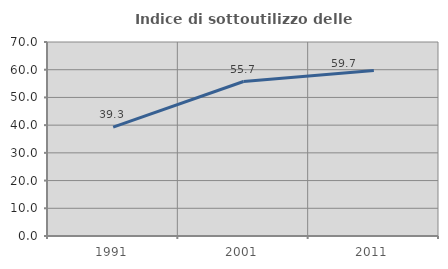
| Category | Indice di sottoutilizzo delle abitazioni  |
|---|---|
| 1991.0 | 39.286 |
| 2001.0 | 55.738 |
| 2011.0 | 59.677 |